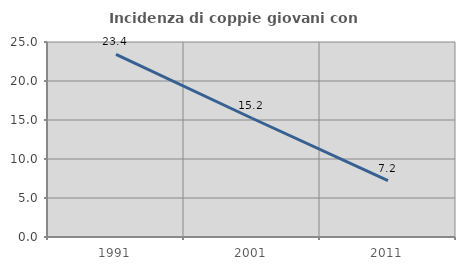
| Category | Incidenza di coppie giovani con figli |
|---|---|
| 1991.0 | 23.41 |
| 2001.0 | 15.225 |
| 2011.0 | 7.218 |